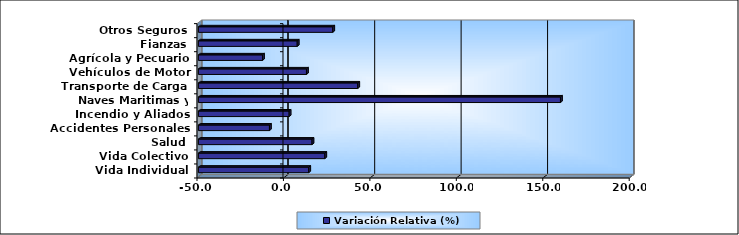
| Category | Variación Relativa (%) |
|---|---|
| Vida Individual | 13.786 |
| Vida Colectivo | 23.076 |
| Salud | 15.7 |
| Accidentes Personales | -8.922 |
| Incendio y Aliados | 2.472 |
| Naves Maritimas y Aéreas | 159.402 |
| Transporte de Carga | 42.141 |
| Vehículos de Motor | 12.489 |
| Agrícola y Pecuario | -12.953 |
| Fianzas | 7.135 |
| Otros Seguros | 27.679 |